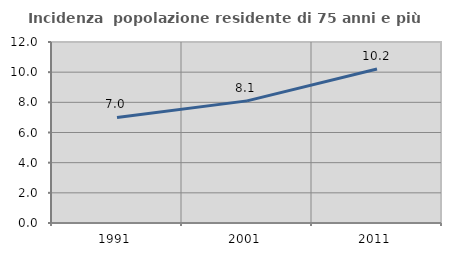
| Category | Incidenza  popolazione residente di 75 anni e più |
|---|---|
| 1991.0 | 6.995 |
| 2001.0 | 8.097 |
| 2011.0 | 10.214 |